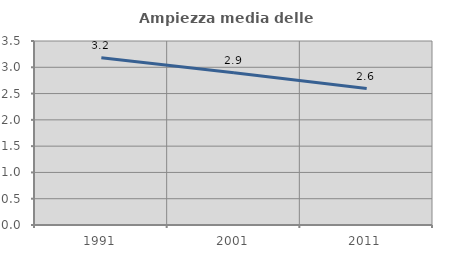
| Category | Ampiezza media delle famiglie |
|---|---|
| 1991.0 | 3.181 |
| 2001.0 | 2.898 |
| 2011.0 | 2.595 |